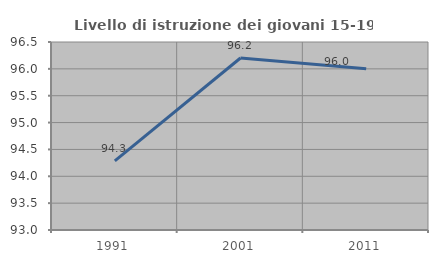
| Category | Livello di istruzione dei giovani 15-19 anni |
|---|---|
| 1991.0 | 94.286 |
| 2001.0 | 96.203 |
| 2011.0 | 96 |